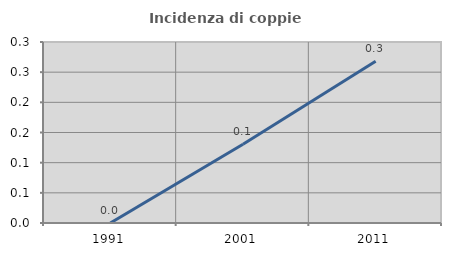
| Category | Incidenza di coppie miste |
|---|---|
| 1991.0 | 0 |
| 2001.0 | 0.131 |
| 2011.0 | 0.268 |